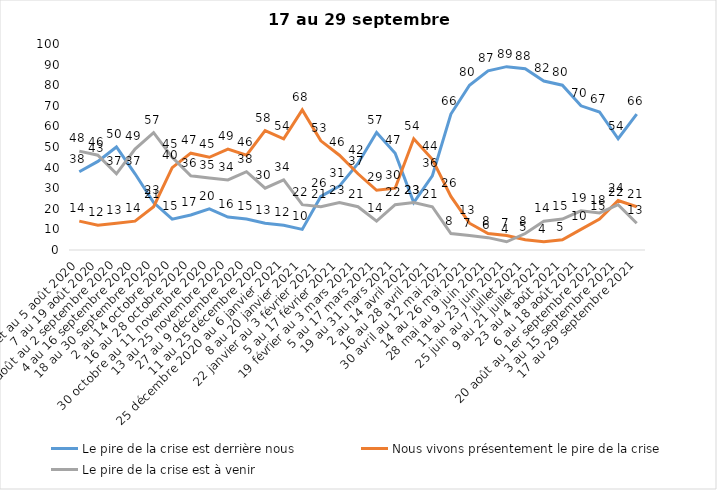
| Category | Le pire de la crise est derrière nous | Nous vivons présentement le pire de la crise | Le pire de la crise est à venir |
|---|---|---|---|
| 24 juillet au 5 août 2020 | 38 | 14 | 48 |
| 7 au 19 août 2020 | 43 | 12 | 46 |
| 21 août au 2 septembre 2020 | 50 | 13 | 37 |
| 4 au 16 septembre 2020 | 37 | 14 | 49 |
| 18 au 30 septembre 2020 | 23 | 21 | 57 |
| 2 au 14 octobre 2020 | 15 | 40 | 45 |
| 16 au 28 octobre 2020 | 17 | 47 | 36 |
| 30 octobre au 11 novembre 2020 | 20 | 45 | 35 |
| 13 au 25 novembre 2020 | 16 | 49 | 34 |
| 27 au 9 décembre 2020 | 15 | 46 | 38 |
| 11 au 25 décembre 2020 | 13 | 58 | 30 |
| 25 décembre 2020 au 6 janvier 2021 | 12 | 54 | 34 |
| 8 au 20 janvier 2021 | 10 | 68 | 22 |
| 22 janvier au 3 février 2021 | 26 | 53 | 21 |
| 5 au 17 février 2021 | 31 | 46 | 23 |
| 19 février au 3 mars 2021 | 42 | 37 | 21 |
| 5 au 17 mars 2021 | 57 | 29 | 14 |
| 19 au 31 mars 2021 | 47 | 30 | 22 |
| 2 au 14 avril 2021 | 23 | 54 | 23 |
| 16 au 28 avril 2021 | 36 | 44 | 21 |
| 30 avril au 12 mai 2021 | 66 | 26 | 8 |
| 14 au 26 mai 2021 | 80 | 13 | 7 |
| 28 mai au 9 juin 2021 | 87 | 8 | 6 |
| 11 au 23 juin 2021 | 89 | 7 | 4 |
| 25 juin au 7 juillet 2021 | 88 | 5 | 8 |
| 9 au 21 juillet 2021 | 82 | 4 | 14 |
| 23 au 4 août 2021 | 80 | 5 | 15 |
| 6 au 18 août 2021 | 70 | 10 | 19 |
| 20 août au 1er septembre 2021 | 67 | 15 | 18 |
| 3 au 15 septembre 2021 | 54 | 24 | 22 |
| 17 au 29 septembre 2021 | 66 | 21 | 13 |